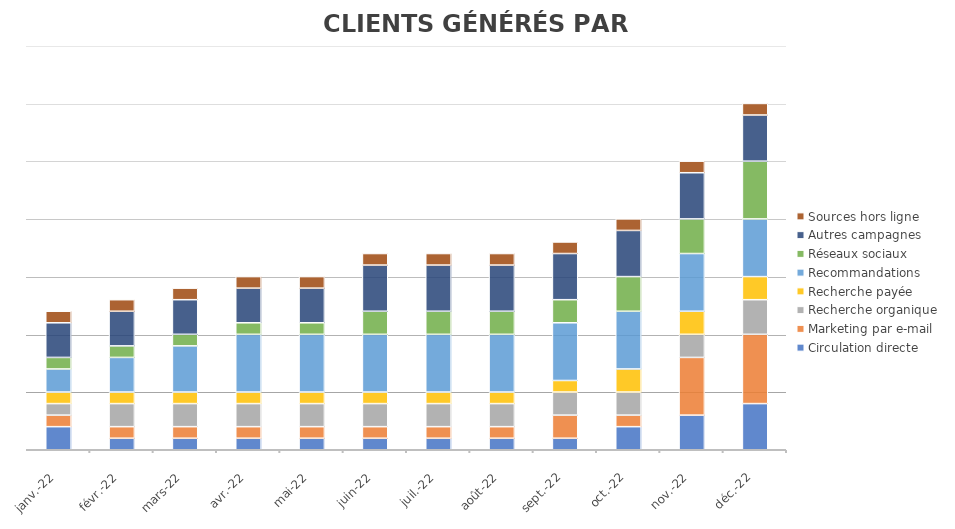
| Category | Circulation directe | Marketing par e-mail | Recherche organique | Recherche payée | Recommandations | Réseaux sociaux | Autres campagnes | Sources hors ligne |
|---|---|---|---|---|---|---|---|---|
| 2022-01-18 | 2 | 1 | 1 | 1 | 2 | 1 | 3 | 1 |
| 2022-02-18 | 1 | 1 | 2 | 1 | 3 | 1 | 3 | 1 |
| 2022-03-18 | 1 | 1 | 2 | 1 | 4 | 1 | 3 | 1 |
| 2022-04-18 | 1 | 1 | 2 | 1 | 5 | 1 | 3 | 1 |
| 2022-05-18 | 1 | 1 | 2 | 1 | 5 | 1 | 3 | 1 |
| 2022-06-18 | 1 | 1 | 2 | 1 | 5 | 2 | 4 | 1 |
| 2022-07-18 | 1 | 1 | 2 | 1 | 5 | 2 | 4 | 1 |
| 2022-08-18 | 1 | 1 | 2 | 1 | 5 | 2 | 4 | 1 |
| 2022-09-18 | 1 | 2 | 2 | 1 | 5 | 2 | 4 | 1 |
| 2022-10-18 | 2 | 1 | 2 | 2 | 5 | 3 | 4 | 1 |
| 2022-11-18 | 3 | 5 | 2 | 2 | 5 | 3 | 4 | 1 |
| 2022-12-18 | 4 | 6 | 3 | 2 | 5 | 5 | 4 | 1 |